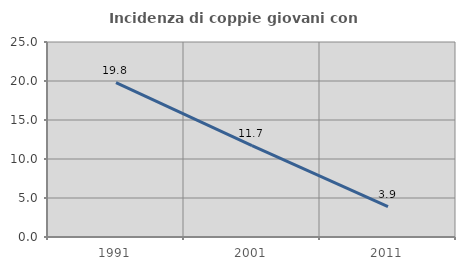
| Category | Incidenza di coppie giovani con figli |
|---|---|
| 1991.0 | 19.788 |
| 2001.0 | 11.724 |
| 2011.0 | 3.883 |